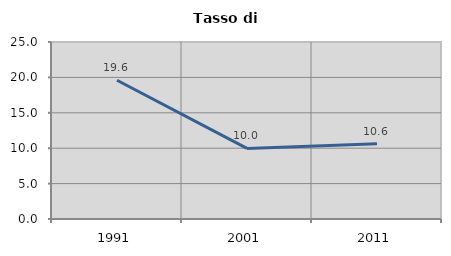
| Category | Tasso di disoccupazione   |
|---|---|
| 1991.0 | 19.595 |
| 2001.0 | 9.968 |
| 2011.0 | 10.622 |